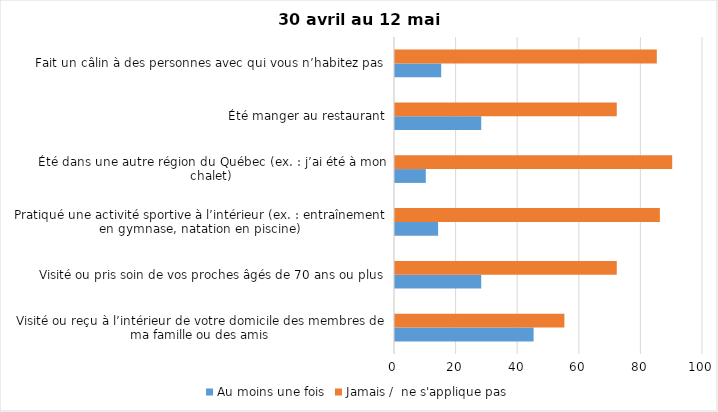
| Category | Au moins une fois | Jamais /  ne s'applique pas |
|---|---|---|
| Visité ou reçu à l’intérieur de votre domicile des membres de ma famille ou des amis | 45 | 55 |
| Visité ou pris soin de vos proches âgés de 70 ans ou plus | 28 | 72 |
| Pratiqué une activité sportive à l’intérieur (ex. : entraînement en gymnase, natation en piscine) | 14 | 86 |
| Été dans une autre région du Québec (ex. : j’ai été à mon chalet) | 10 | 90 |
| Été manger au restaurant | 28 | 72 |
| Fait un câlin à des personnes avec qui vous n’habitez pas | 15 | 85 |